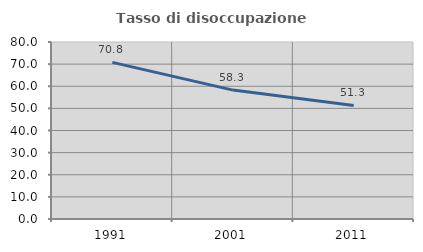
| Category | Tasso di disoccupazione giovanile  |
|---|---|
| 1991.0 | 70.796 |
| 2001.0 | 58.258 |
| 2011.0 | 51.316 |